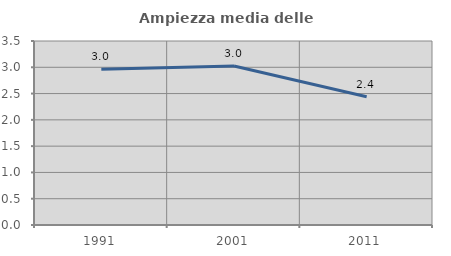
| Category | Ampiezza media delle famiglie |
|---|---|
| 1991.0 | 2.96 |
| 2001.0 | 3.024 |
| 2011.0 | 2.44 |